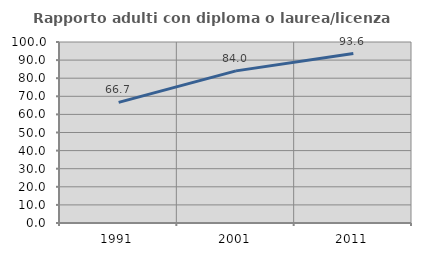
| Category | Rapporto adulti con diploma o laurea/licenza media  |
|---|---|
| 1991.0 | 66.667 |
| 2001.0 | 84.043 |
| 2011.0 | 93.59 |